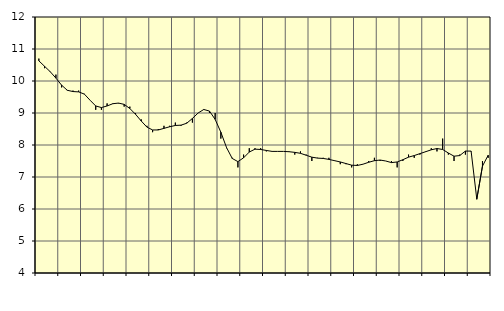
| Category | Piggar | Tillverkning av verkstadsvaror, SNI 25-30, 33 |
|---|---|---|
| nan | 10.7 | 10.63 |
| 1.0 | 10.4 | 10.46 |
| 1.0 | 10.3 | 10.29 |
| 1.0 | 10.2 | 10.09 |
| nan | 9.8 | 9.87 |
| 2.0 | 9.7 | 9.71 |
| 2.0 | 9.7 | 9.67 |
| 2.0 | 9.7 | 9.66 |
| nan | 9.6 | 9.59 |
| 3.0 | 9.4 | 9.4 |
| 3.0 | 9.1 | 9.22 |
| 3.0 | 9.1 | 9.17 |
| nan | 9.3 | 9.22 |
| 4.0 | 9.3 | 9.29 |
| 4.0 | 9.3 | 9.31 |
| 4.0 | 9.2 | 9.27 |
| nan | 9.2 | 9.14 |
| 5.0 | 9 | 8.96 |
| 5.0 | 8.8 | 8.75 |
| 5.0 | 8.6 | 8.56 |
| nan | 8.4 | 8.47 |
| 6.0 | 8.5 | 8.47 |
| 6.0 | 8.6 | 8.52 |
| 6.0 | 8.6 | 8.57 |
| nan | 8.7 | 8.61 |
| 7.0 | 8.6 | 8.62 |
| 7.0 | 8.7 | 8.68 |
| 7.0 | 8.7 | 8.83 |
| nan | 9 | 9 |
| 8.0 | 9.1 | 9.11 |
| 8.0 | 9 | 9.06 |
| 8.0 | 9 | 8.8 |
| nan | 8.2 | 8.4 |
| 9.0 | 7.9 | 7.92 |
| 9.0 | 7.6 | 7.58 |
| 9.0 | 7.3 | 7.48 |
| nan | 7.7 | 7.6 |
| 10.0 | 7.9 | 7.78 |
| 10.0 | 7.9 | 7.87 |
| 10.0 | 7.9 | 7.86 |
| nan | 7.8 | 7.83 |
| 11.0 | 7.8 | 7.8 |
| 11.0 | 7.8 | 7.8 |
| 11.0 | 7.8 | 7.8 |
| nan | 7.8 | 7.79 |
| 12.0 | 7.7 | 7.77 |
| 12.0 | 7.8 | 7.74 |
| 12.0 | 7.7 | 7.68 |
| nan | 7.5 | 7.62 |
| 13.0 | 7.6 | 7.59 |
| 13.0 | 7.6 | 7.58 |
| 13.0 | 7.6 | 7.55 |
| nan | 7.5 | 7.51 |
| 14.0 | 7.4 | 7.47 |
| 14.0 | 7.4 | 7.42 |
| 14.0 | 7.3 | 7.37 |
| nan | 7.4 | 7.36 |
| 15.0 | 7.4 | 7.4 |
| 15.0 | 7.5 | 7.46 |
| 15.0 | 7.6 | 7.51 |
| nan | 7.5 | 7.53 |
| 16.0 | 7.5 | 7.5 |
| 16.0 | 7.5 | 7.45 |
| 16.0 | 7.3 | 7.47 |
| nan | 7.5 | 7.54 |
| 17.0 | 7.7 | 7.62 |
| 17.0 | 7.6 | 7.67 |
| 17.0 | 7.7 | 7.73 |
| nan | 7.8 | 7.79 |
| 18.0 | 7.9 | 7.85 |
| 18.0 | 7.8 | 7.89 |
| 18.0 | 8.2 | 7.86 |
| nan | 7.7 | 7.75 |
| 19.0 | 7.5 | 7.65 |
| 19.0 | 7.7 | 7.67 |
| 19.0 | 7.7 | 7.81 |
| nan | 7.8 | 7.81 |
| 20.0 | 6.3 | 6.31 |
| 20.0 | 7.5 | 7.34 |
| 20.0 | 7.6 | 7.68 |